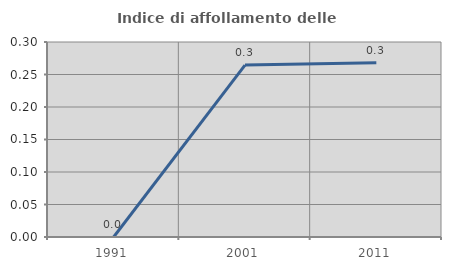
| Category | Indice di affollamento delle abitazioni  |
|---|---|
| 1991.0 | 0 |
| 2001.0 | 0.265 |
| 2011.0 | 0.268 |